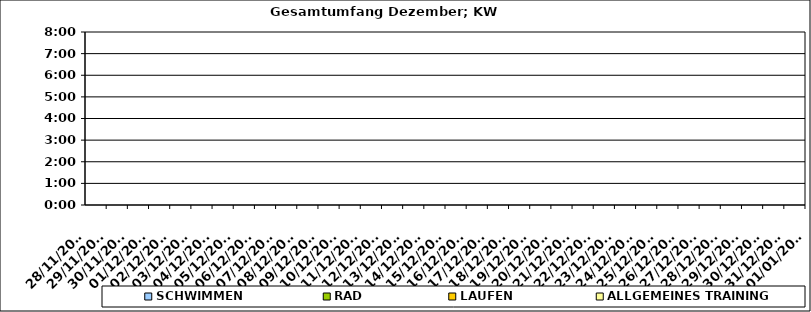
| Category | SCHWIMMEN | RAD | LAUFEN | ALLGEMEINES TRAINING |
|---|---|---|---|---|
| 28/11/2022 |  |  |  | 0 |
| 29/11/2022 |  |  |  | 0 |
| 30/11/2022 |  |  |  | 0 |
| 01/12/2022 |  |  |  | 0 |
| 02/12/2022 |  |  |  | 0 |
| 03/12/2022 |  |  |  | 0 |
| 04/12/2022 |  |  |  | 0 |
| 05/12/2022 |  |  |  | 0 |
| 06/12/2022 |  |  |  | 0 |
| 07/12/2022 |  |  |  | 0 |
| 08/12/2022 |  |  |  | 0 |
| 09/12/2022 |  |  |  | 0 |
| 10/12/2022 |  |  |  | 0 |
| 11/12/2022 |  |  |  | 0 |
| 12/12/2022 |  |  |  | 0 |
| 13/12/2022 |  |  |  | 0 |
| 14/12/2022 |  |  |  | 0 |
| 15/12/2022 |  |  |  | 0 |
| 16/12/2022 |  |  |  | 0 |
| 17/12/2022 |  |  |  | 0 |
| 18/12/2022 |  |  |  | 0 |
| 19/12/2022 |  |  |  | 0 |
| 20/12/2022 |  |  |  | 0 |
| 21/12/2022 |  |  |  | 0 |
| 22/12/2022 |  |  |  | 0 |
| 23/12/2022 |  |  |  | 0 |
| 24/12/2022 |  |  |  | 0 |
| 25/12/2022 |  |  |  | 0 |
| 26/12/2022 |  |  |  | 0 |
| 27/12/2022 |  |  |  | 0 |
| 28/12/2022 |  |  |  | 0 |
| 29/12/2022 |  |  |  | 0 |
| 30/12/2022 |  |  |  | 0 |
| 31/12/2022 |  |  |  | 0 |
| 01/01/2023 |  |  |  | 0 |